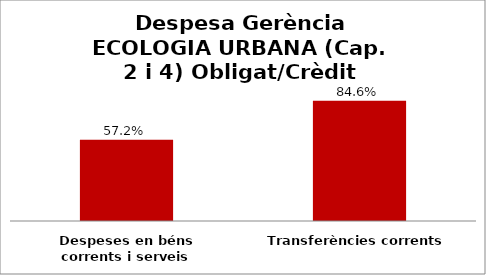
| Category | Series 0 |
|---|---|
| Despeses en béns corrents i serveis | 0.572 |
| Transferències corrents | 0.846 |